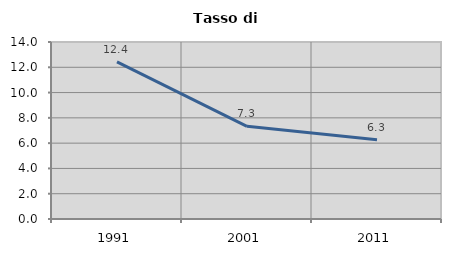
| Category | Tasso di disoccupazione   |
|---|---|
| 1991.0 | 12.429 |
| 2001.0 | 7.333 |
| 2011.0 | 6.266 |